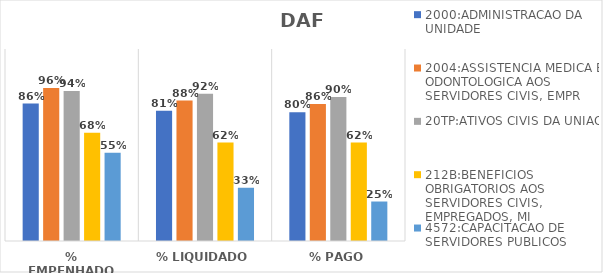
| Category | 2000:ADMINISTRACAO DA UNIDADE | 2004:ASSISTENCIA MEDICA E ODONTOLOGICA AOS SERVIDORES CIVIS, EMPR | 20TP:ATIVOS CIVIS DA UNIAO | 212B:BENEFICIOS OBRIGATORIOS AOS SERVIDORES CIVIS, EMPREGADOS, MI | 4572:CAPACITACAO DE SERVIDORES PUBLICOS FEDERAIS EM PROCESSO DE Q |
|---|---|---|---|---|---|
| % EMPENHADO | 0.859 | 0.957 | 0.938 | 0.677 | 0.551 |
| % LIQUIDADO | 0.814 | 0.878 | 0.92 | 0.615 | 0.334 |
| % PAGO | 0.804 | 0.856 | 0.899 | 0.615 | 0.247 |